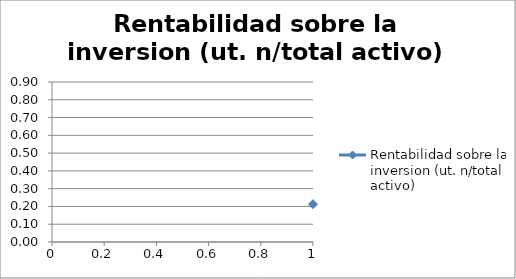
| Category | Rentabilidad sobre la inversion (ut. n/total activo) |
|---|---|
| 0 | 0.213 |
| 1 | 0.523 |
| 2 | 0.431 |
| 3 | 0.509 |
| 4 | 0.334 |
| 5 | 0.592 |
| 6 | 0.472 |
| 7 | 0.806 |